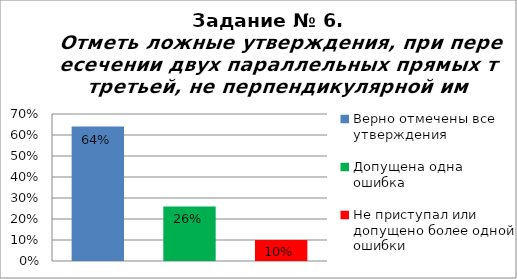
| Category | Отметь ложные утверждения, при пересечении двух параллельных прямых третьей, не перпендикулярной им. |
|---|---|
| Верно отмечены все утверждения | 0.64 |
| Допущена одна ошибка | 0.26 |
| Не приступал или допущено более одной ошибки | 0.1 |